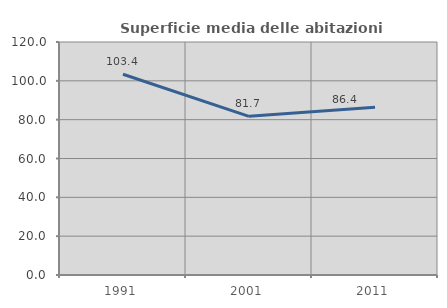
| Category | Superficie media delle abitazioni occupate |
|---|---|
| 1991.0 | 103.387 |
| 2001.0 | 81.707 |
| 2011.0 | 86.446 |